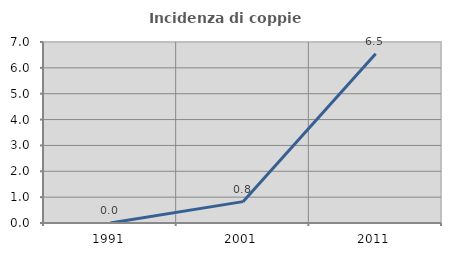
| Category | Incidenza di coppie miste |
|---|---|
| 1991.0 | 0 |
| 2001.0 | 0.826 |
| 2011.0 | 6.542 |